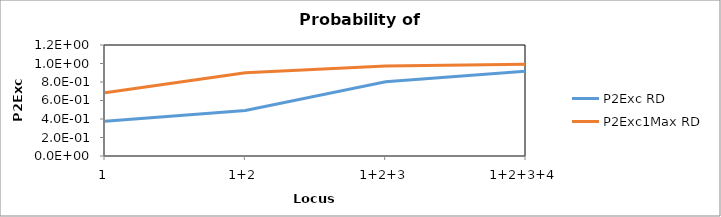
| Category | P2Exc RD | P2Exc1Max RD |
|---|---|---|
| 1 | 0.375 | 0.684 |
| 1+2 | 0.493 | 0.9 |
| 1+2+3 | 0.804 | 0.973 |
| 1+2+3+4 | 0.916 | 0.993 |